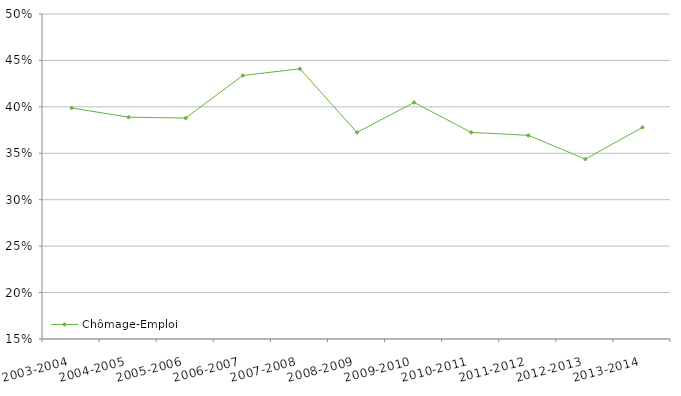
| Category | Chômage-Emploi |
|---|---|
| 2003-2004 | 0.399 |
| 2004-2005 | 0.389 |
| 2005-2006 | 0.388 |
| 2006-2007 | 0.434 |
| 2007-2008 | 0.441 |
| 2008-2009 | 0.372 |
| 2009-2010 | 0.405 |
| 2010-2011 | 0.372 |
| 2011-2012 | 0.369 |
| 2012-2013 | 0.344 |
| 2013-2014 | 0.378 |